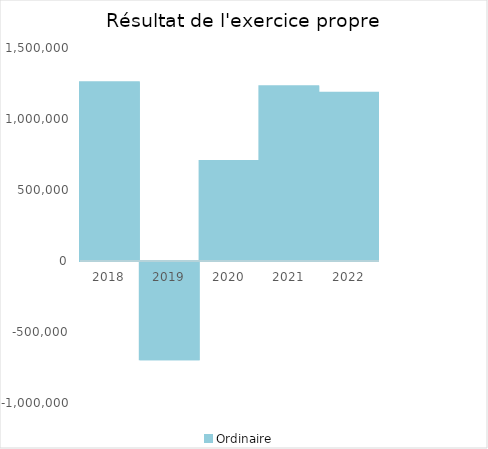
| Category |   | Ordinaire |    |
|---|---|---|---|
| 2018.0 |  | 1258440.08 |  |
| 2019.0 |  | -691889.28 |  |
| 2020.0 |  | 704360.04 |  |
| 2021.0 |  | 1231483.81 |  |
| 2022.0 |  | 1185491.44 |  |